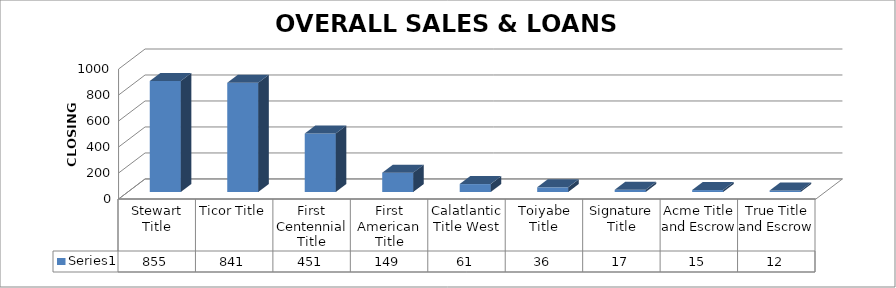
| Category | Series 0 |
|---|---|
| Stewart Title | 855 |
| Ticor Title | 841 |
| First Centennial Title | 451 |
| First American Title | 149 |
| Calatlantic Title West | 61 |
| Toiyabe Title | 36 |
| Signature Title | 17 |
| Acme Title and Escrow | 15 |
| True Title and Escrow | 12 |